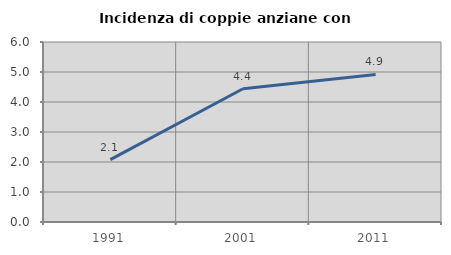
| Category | Incidenza di coppie anziane con figli |
|---|---|
| 1991.0 | 2.079 |
| 2001.0 | 4.441 |
| 2011.0 | 4.918 |